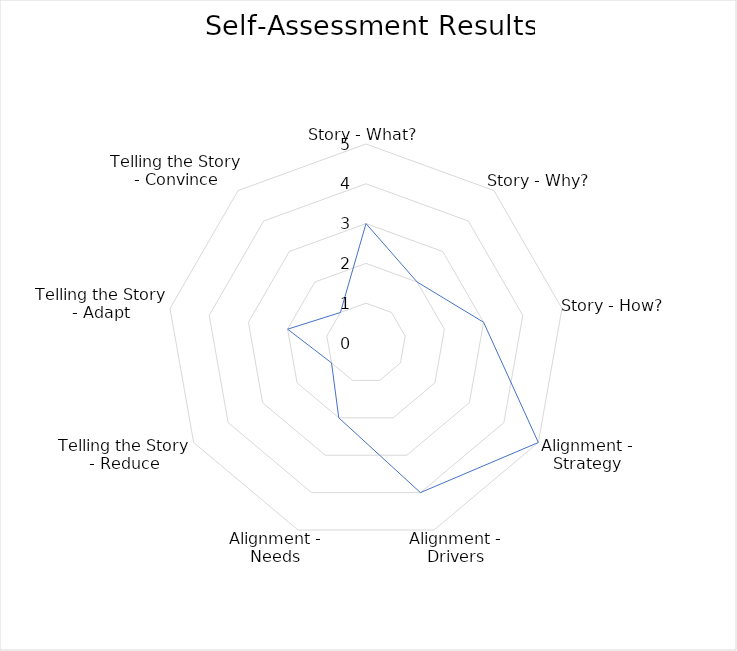
| Category | Series 0 |
|---|---|
| Story - What? | 3 |
| Story - Why? | 2 |
| Story - How? | 3 |
| Alignment - Strategy | 5 |
| Alignment - Drivers | 4 |
| Alignment - Needs | 2 |
| Telling the Story - Reduce | 1 |
| Telling the Story - Adapt | 2 |
| Telling the Story - Convince | 1 |